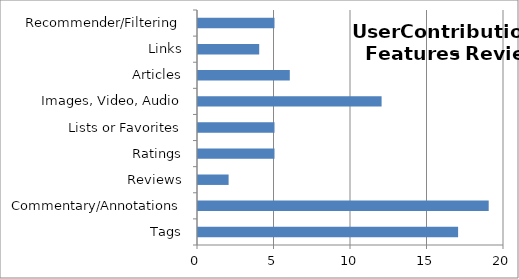
| Category | Series 0 |
|---|---|
| Tags | 17 |
| Commentary/Annotations | 19 |
| Reviews | 2 |
| Ratings | 5 |
| Lists or Favorites | 5 |
| Images, Video, Audio | 12 |
| Articles | 6 |
| Links | 4 |
| Recommender/Filtering | 5 |